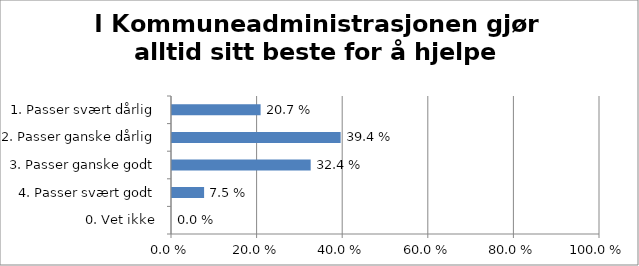
| Category | I Kommuneadministrasjonen gjør alltid sitt beste for å hjelpe innbyggerne. |
|---|---|
| 1. Passer svært dårlig | 0.207 |
| 2. Passer ganske dårlig | 0.394 |
| 3. Passer ganske godt | 0.324 |
| 4. Passer svært godt | 0.075 |
| 0. Vet ikke | 0 |